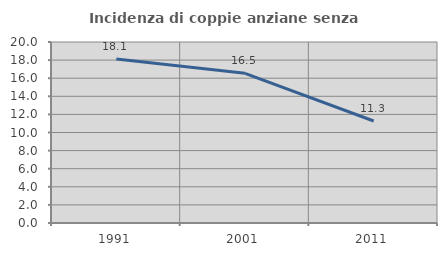
| Category | Incidenza di coppie anziane senza figli  |
|---|---|
| 1991.0 | 18.116 |
| 2001.0 | 16.541 |
| 2011.0 | 11.268 |